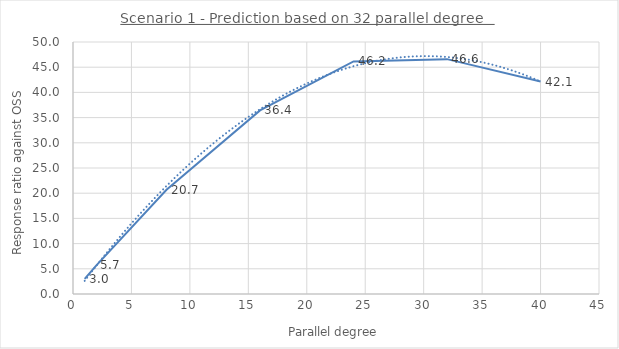
| Category | Series 0 |
|---|---|
| 1.0 | 2.996 |
| 2.0 | 5.672 |
| 8.0 | 20.68 |
| 16.0 | 36.429 |
| 24.0 | 46.153 |
| 32.0 | 46.599 |
| 40.0 | 42.149 |